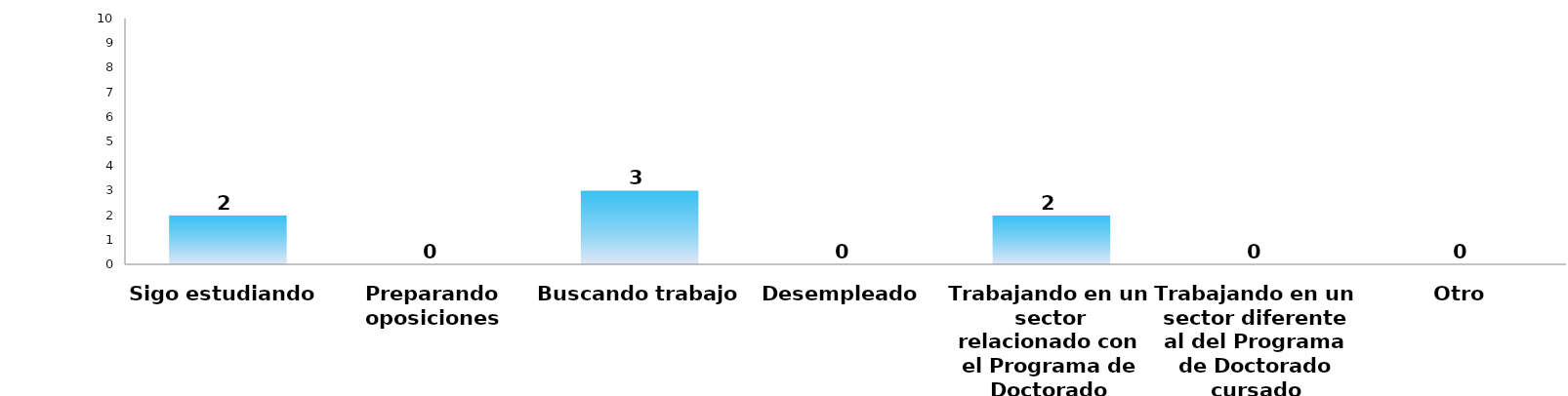
| Category | Series 0 |
|---|---|
| Sigo estudiando | 2 |
| Preparando oposiciones | 0 |
| Buscando trabajo | 3 |
| Desempleado | 0 |
| Trabajando en un sector relacionado con el Programa de Doctorado cursado | 2 |
| Trabajando en un sector diferente al del Programa de Doctorado cursado | 0 |
| Otro | 0 |